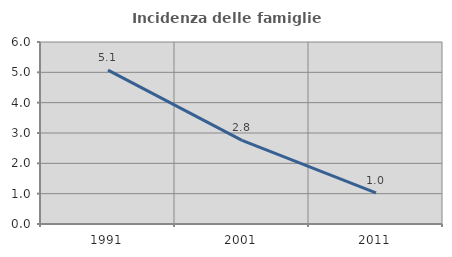
| Category | Incidenza delle famiglie numerose |
|---|---|
| 1991.0 | 5.072 |
| 2001.0 | 2.759 |
| 2011.0 | 1.029 |